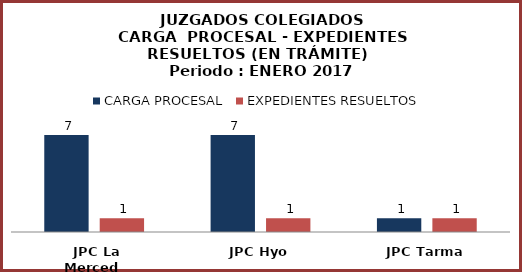
| Category | CARGA PROCESAL | EXPEDIENTES RESUELTOS |
|---|---|---|
| JPC La Merced | 7 | 1 |
| JPC Hyo | 7 | 1 |
| JPC Tarma | 1 | 1 |